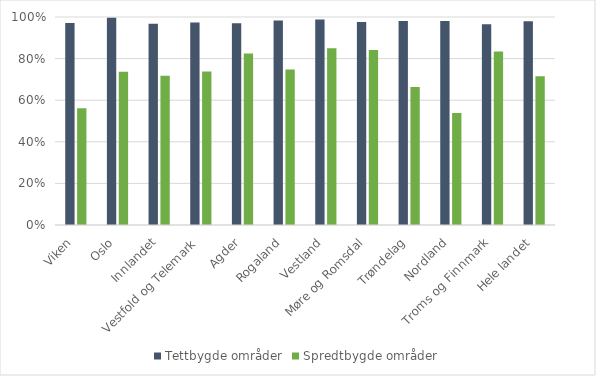
| Category | Tettbygde områder | Spredtbygde områder |
|---|---|---|
| Viken | 0.971 | 0.562 |
| Oslo | 0.997 | 0.737 |
| Innlandet | 0.967 | 0.718 |
| Vestfold og Telemark | 0.973 | 0.739 |
| Agder | 0.97 | 0.825 |
| Rogaland | 0.984 | 0.747 |
| Vestland | 0.988 | 0.85 |
| Møre og Romsdal | 0.976 | 0.841 |
| Trøndelag | 0.98 | 0.663 |
| Nordland | 0.981 | 0.538 |
| Troms og Finnmark | 0.966 | 0.834 |
| Hele landet | 0.98 | 0.715 |